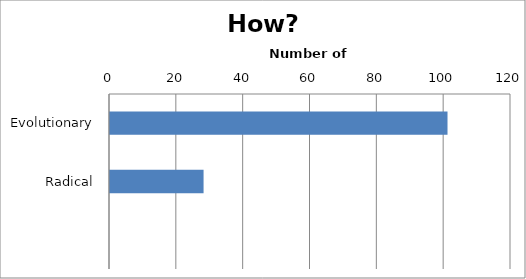
| Category | Series 0 |
|---|---|
| Evolutionary | 101 |
| Radical | 28 |